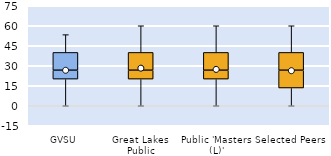
| Category | 25th | 50th | 75th |
|---|---|---|---|
| GVSU | 20 | 6.667 | 13.333 |
| Great Lakes Public | 20 | 6.667 | 13.333 |
| Public 'Masters (L)' | 20 | 6.667 | 13.333 |
| Selected Peers | 13.333 | 13.333 | 13.333 |